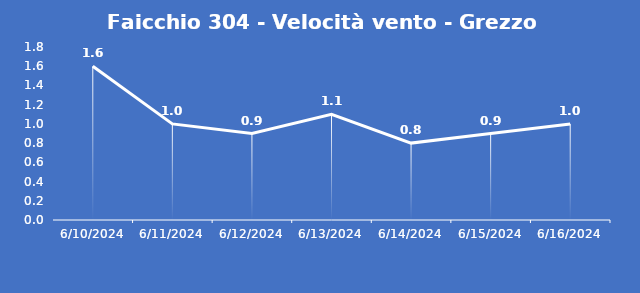
| Category | Faicchio 304 - Velocità vento - Grezzo (m/s) |
|---|---|
| 6/10/24 | 1.6 |
| 6/11/24 | 1 |
| 6/12/24 | 0.9 |
| 6/13/24 | 1.1 |
| 6/14/24 | 0.8 |
| 6/15/24 | 0.9 |
| 6/16/24 | 1 |